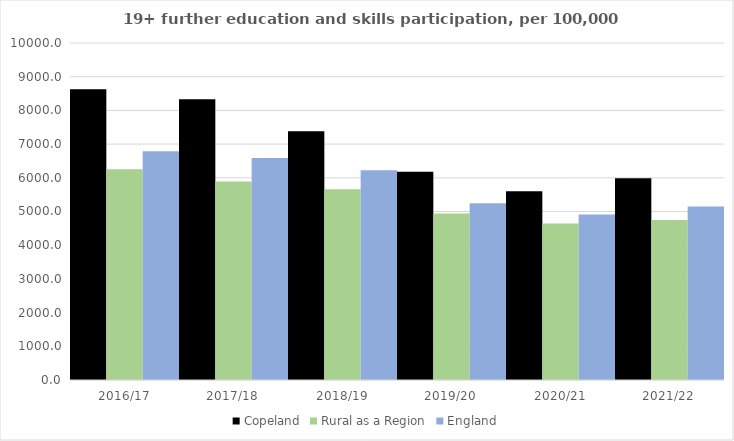
| Category | Copeland | Rural as a Region | England |
|---|---|---|---|
| 2016/17 | 8627 | 6253.401 | 6788 |
| 2017/18 | 8332 | 5892.029 | 6588 |
| 2018/19 | 7379 | 5661.873 | 6227 |
| 2019/20 | 6178 | 4943.801 | 5244 |
| 2020/21 | 5601 | 4646.727 | 4913 |
| 2021/22 | 5984 | 4747.049 | 5151 |